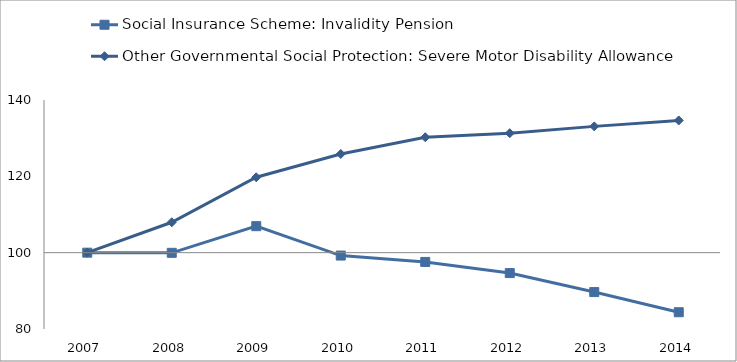
| Category | Social Insurance Scheme: Invalidity Pension | Other Governmental Social Protection: Severe Motor Disability Allowance | Other Governmental Social Protection: Care Allowance Scheme for Paraplegic | Other Governmental Social Protection: Care Allowance Scheme for Quadriplegic  | Other Governmental Social Protection: Special Allowance for Blind Persons  | Other Governmental Social Protection: Mobility Allowance. | 0 |
|---|---|---|---|---|---|---|---|
| 2007.0 | 100 | 100 |  |  |  |  |  |
| 2008.0 | 99.96 | 107.967 |  |  |  |  |  |
| 2009.0 | 106.942 | 119.756 |  |  |  |  |  |
| 2010.0 | 99.245 | 125.854 |  |  |  |  |  |
| 2011.0 | 97.574 | 130.244 |  |  |  |  |  |
| 2012.0 | 94.649 | 131.301 |  |  |  |  |  |
| 2013.0 | 89.675 | 133.089 |  |  |  |  |  |
| 2014.0 | 84.391 | 134.634 |  |  |  |  |  |